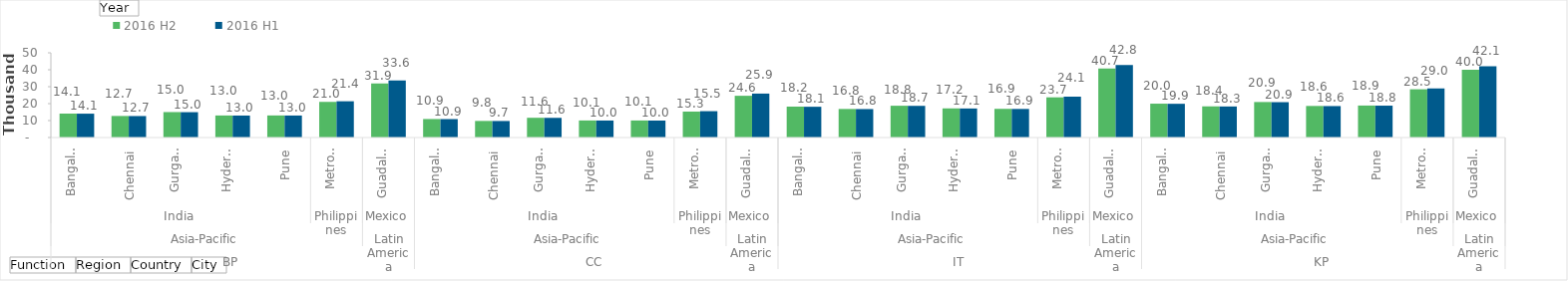
| Category | 2016 H2    | 2016 H1    |
|---|---|---|
| 0 | 14126.756 | 14073.759 |
| 1 | 12715.147 | 12671.149 |
| 2 | 15011.439 | 14955.898 |
| 3 | 13005.254 | 12960.444 |
| 4 | 13022.284 | 12977.602 |
| 5 | 21032.375 | 21399.771 |
| 6 | 31935.95 | 33620.507 |
| 7 | 10912.829 | 10871.59 |
| 8 | 9779.086 | 9744.845 |
| 9 | 11648.937 | 11605.661 |
| 10 | 10059.291 | 10024.182 |
| 11 | 10052.06 | 10017.171 |
| 12 | 15285.819 | 15548.362 |
| 13 | 24631.232 | 25927.598 |
| 14 | 18219.715 | 18149.649 |
| 15 | 16846.181 | 16786.85 |
| 16 | 18757.32 | 18686.412 |
| 17 | 17193.9 | 17133.47 |
| 18 | 16921.435 | 16862.322 |
| 19 | 23715.726 | 24130.256 |
| 20 | 40672.156 | 42816.643 |
| 21 | 19981.252 | 19903.653 |
| 22 | 18385.73 | 18320.47 |
| 23 | 20947.011 | 20866.691 |
| 24 | 18625.408 | 18559.494 |
| 25 | 18872.617 | 18805.894 |
| 26 | 28476.416 | 28972.334 |
| 27 | 39985.608 | 42095.043 |